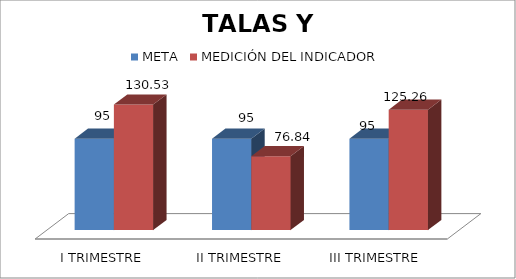
| Category | META | MEDICIÓN DEL INDICADOR |
|---|---|---|
| I TRIMESTRE | 95 | 130.53 |
| II TRIMESTRE | 95 | 76.84 |
| III TRIMESTRE  | 95 | 125.26 |